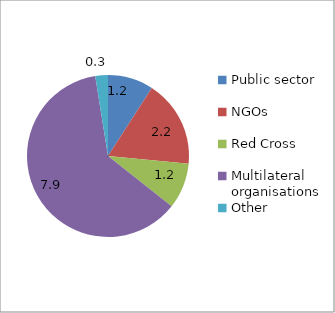
| Category | 2009 |
|---|---|
| Public sector | 1.167 |
| NGOs  | 2.232 |
| Red Cross | 1.17 |
| Multilateral organisations | 7.93 |
| Other | 0.324 |